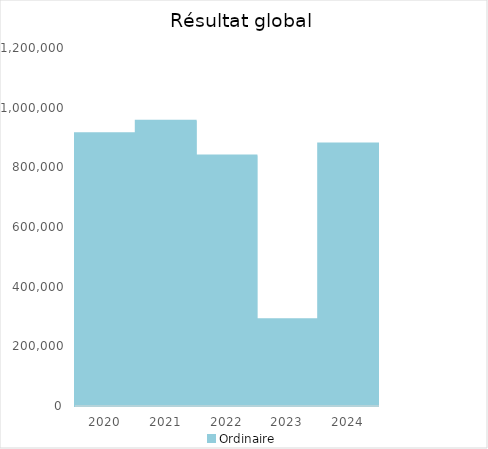
| Category |   | Ordinaire |    |
|---|---|---|---|
| 2020.0 |  | 913885.18 |  |
| 2021.0 |  | 956523.47 |  |
| 2022.0 |  | 839870.63 |  |
| 2023.0 |  | 290375.31 |  |
| 2024.0 |  | 879712.27 |  |